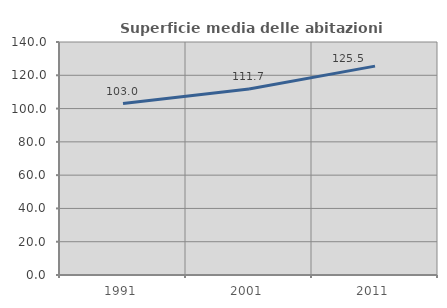
| Category | Superficie media delle abitazioni occupate |
|---|---|
| 1991.0 | 102.986 |
| 2001.0 | 111.725 |
| 2011.0 | 125.497 |